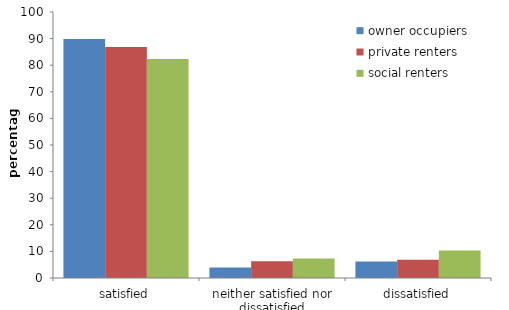
| Category | owner occupiers | private renters | social renters |
|---|---|---|---|
| satisfied | 89.865 | 86.815 | 82.333 |
| neither satisfied nor dissatisfied | 3.955 | 6.309 | 7.372 |
| dissatisfied | 6.18 | 6.877 | 10.295 |